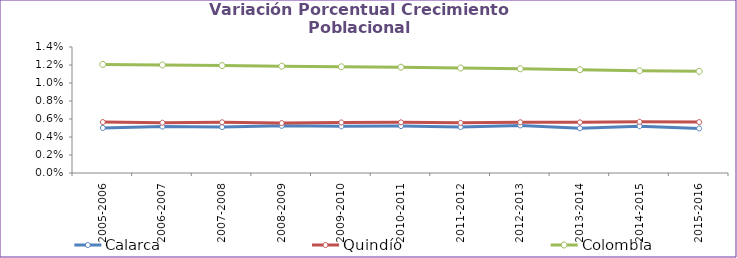
| Category | Calarca | Quindío | Colombia |
|---|---|---|---|
| 2005-2006 | 0.005 | 0.006 | 0.012 |
| 2006-2007 | 0.005 | 0.006 | 0.012 |
| 2007-2008 | 0.005 | 0.006 | 0.012 |
| 2008-2009 | 0.005 | 0.006 | 0.012 |
| 2009-2010 | 0.005 | 0.006 | 0.012 |
| 2010-2011 | 0.005 | 0.006 | 0.012 |
| 2011-2012 | 0.005 | 0.006 | 0.012 |
| 2012-2013 | 0.005 | 0.006 | 0.012 |
| 2013-2014 | 0.005 | 0.006 | 0.011 |
| 2014-2015 | 0.005 | 0.006 | 0.011 |
| 2015-2016 | 0.005 | 0.006 | 0.011 |